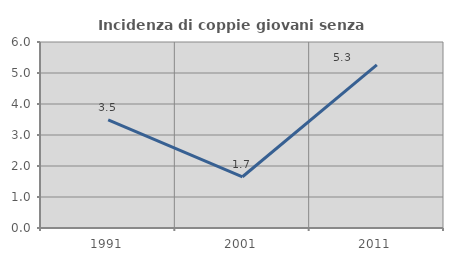
| Category | Incidenza di coppie giovani senza figli |
|---|---|
| 1991.0 | 3.488 |
| 2001.0 | 1.653 |
| 2011.0 | 5.263 |